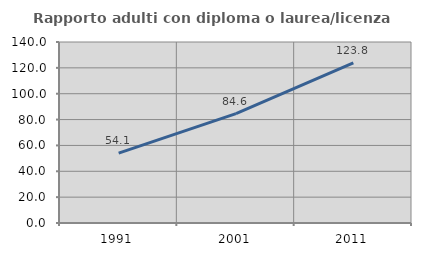
| Category | Rapporto adulti con diploma o laurea/licenza media  |
|---|---|
| 1991.0 | 54.095 |
| 2001.0 | 84.573 |
| 2011.0 | 123.826 |